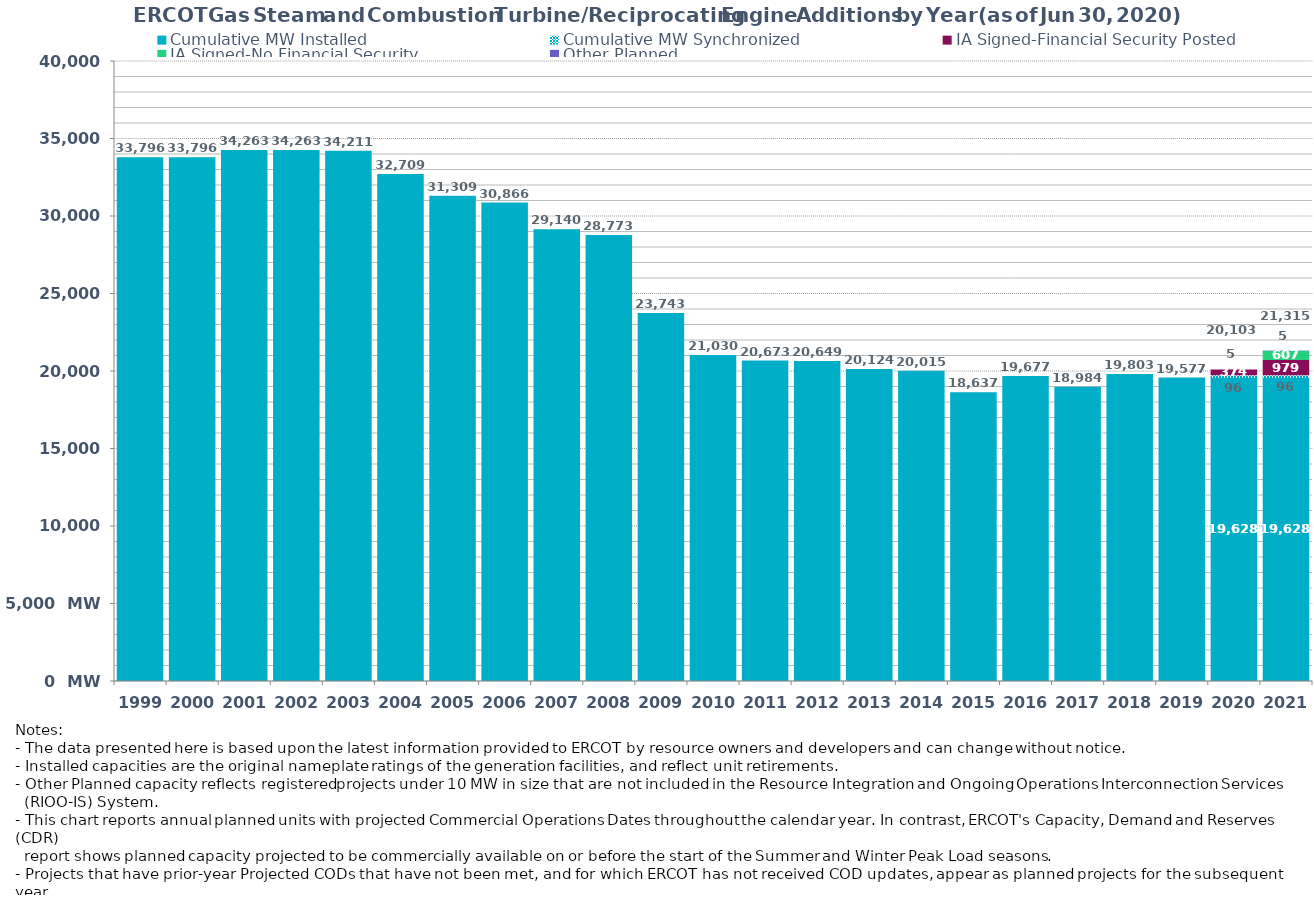
| Category | Cumulative MW Installed | Cumulative MW Synchronized | IA Signed-Financial Security Posted  | IA Signed-No Financial Security  | Other Planned | Series 2 |
|---|---|---|---|---|---|---|
| 1999.0 | 33796.03 | 0 | 0 | 0 | 0 | 33796.03 |
| 2000.0 | 33796.03 | 0 | 0 | 0 | 0 | 33796.03 |
| 2001.0 | 34262.59 | 0 | 0 | 0 | 0 | 34262.59 |
| 2002.0 | 34262.59 | 0 | 0 | 0 | 0 | 34262.59 |
| 2003.0 | 34210.59 | 0 | 0 | 0 | 0 | 34210.59 |
| 2004.0 | 32708.69 | 0 | 0 | 0 | 0 | 32708.69 |
| 2005.0 | 31309.49 | 0 | 0 | 0 | 0 | 31309.49 |
| 2006.0 | 30866.49 | 0 | 0 | 0 | 0 | 30866.49 |
| 2007.0 | 29140.49 | 0 | 0 | 0 | 0 | 29140.49 |
| 2008.0 | 28773.29 | 0 | 0 | 0 | 0 | 28773.29 |
| 2009.0 | 23743.29 | 0 | 0 | 0 | 0 | 23743.29 |
| 2010.0 | 21030.17 | 0 | 0 | 0 | 0 | 21030.17 |
| 2011.0 | 20673.47 | 0 | 0 | 0 | 0 | 20673.47 |
| 2012.0 | 20649.47 | 0 | 0 | 0 | 0 | 20649.47 |
| 2013.0 | 20124.47 | 0 | 0 | 0 | 0 | 20124.47 |
| 2014.0 | 20015.47 | 0 | 0 | 0 | 0 | 20015.47 |
| 2015.0 | 18636.67 | 0 | 0 | 0 | 0 | 18636.67 |
| 2016.0 | 19677.05 | 0 | 0 | 0 | 0 | 19677.05 |
| 2017.0 | 18984.19 | 0 | 0 | 0 | 0 | 18984.19 |
| 2018.0 | 19803.35 | 0 | 0 | 0 | 0 | 19803.35 |
| 2019.0 | 19577.05 | 0 | 0 | 0 | 0 | 19577.05 |
| 2020.0 | 19628.34 | 96 | 374 | 0 | 4.8 | 20103.14 |
| 2021.0 | 19628.34 | 96 | 979 | 607 | 4.8 | 21315.14 |